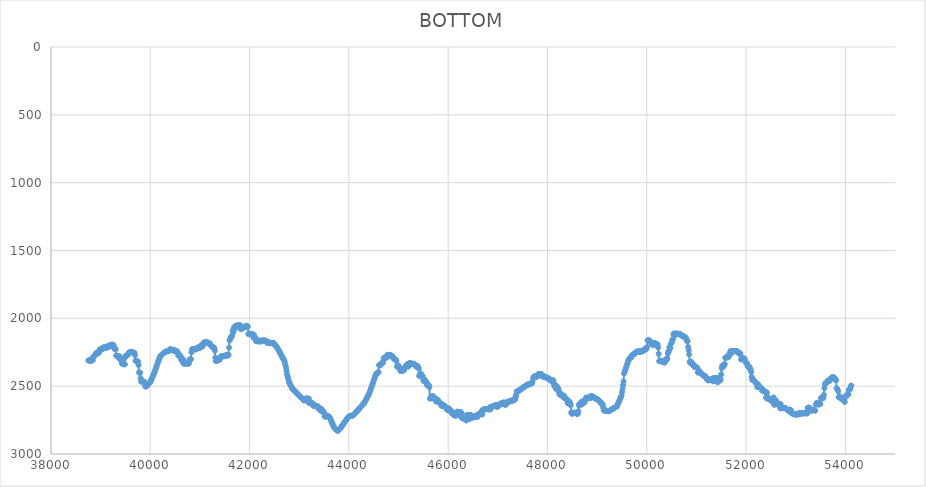
| Category | BOTTOM |
|---|---|
| 38753.4863 | 2310.27 |
| 38760.6201 | 2311.58 |
| 38770.8596 | 2310.26 |
| 38781.0997 | 2311.62 |
| 38791.3398 | 2311.66 |
| 38801.5799 | 2312.7 |
| 38811.82 | 2301.89 |
| 38822.0601 | 2306.12 |
| 38832.3002 | 2310.17 |
| 38842.5403 | 2308.02 |
| 38852.7804 | 2282.06 |
| 38863.0205 | 2281.94 |
| 38873.2606 | 2277.71 |
| 38883.5007 | 2273.53 |
| 38893.7407 | 2270.39 |
| 38903.9808 | 2256.73 |
| 38914.2209 | 2256.68 |
| 38924.461 | 2255.32 |
| 38934.7011 | 2255.4 |
| 38944.9412 | 2258.09 |
| 38955.1813 | 2256.68 |
| 38965.4214 | 2254.61 |
| 38975.6615 | 2231.39 |
| 38985.9016 | 2231.26 |
| 38996.1417 | 2227.25 |
| 39006.3818 | 2229.9 |
| 39016.6219 | 2227.25 |
| 39026.862 | 2229.65 |
| 39037.102 | 2218.68 |
| 39047.3421 | 2217.44 |
| 39057.5822 | 2221.28 |
| 39067.8223 | 2213.09 |
| 39078.0624 | 2213.09 |
| 39088.3025 | 2213.09 |
| 39098.5426 | 2213.13 |
| 39108.7827 | 2214.62 |
| 39119.0228 | 2218.39 |
| 39129.2629 | 2207.46 |
| 39139.503 | 2207.5 |
| 39149.7431 | 2208.82 |
| 39159.9832 | 2207.5 |
| 39170.2233 | 2208.62 |
| 39180.4633 | 2200.34 |
| 39190.7034 | 2197.52 |
| 39200.9435 | 2194.87 |
| 39211.1836 | 2197.69 |
| 39221.4237 | 2200.29 |
| 39231.6638 | 2196.11 |
| 39241.9039 | 2193.47 |
| 39252.144 | 2196.32 |
| 39262.3841 | 2201.09 |
| 39272.6242 | 2222.98 |
| 39282.8643 | 2224.39 |
| 39293.1044 | 2225.8 |
| 39303.3445 | 2228.6 |
| 39313.5846 | 2275.07 |
| 39323.8246 | 2276.43 |
| 39334.0647 | 2276.64 |
| 39344.3048 | 2283.26 |
| 39354.5449 | 2276.85 |
| 39364.785 | 2290.55 |
| 39375.0251 | 2291.54 |
| 39385.2652 | 2280.01 |
| 39395.5053 | 2304.58 |
| 39405.7454 | 2304.58 |
| 39415.9855 | 2305.43 |
| 39426.2256 | 2332.27 |
| 39436.4657 | 2317.84 |
| 39446.7058 | 2336.92 |
| 39456.9459 | 2335.59 |
| 39467.1859 | 2337.04 |
| 39477.426 | 2339.77 |
| 39487.6661 | 2338.17 |
| 39497.9062 | 2285.95 |
| 39508.1463 | 2275.02 |
| 39518.3864 | 2275.02 |
| 39528.6265 | 2274.86 |
| 39538.8666 | 2269.39 |
| 39549.1067 | 2269.22 |
| 39559.3468 | 2263.42 |
| 39569.5869 | 2252.38 |
| 39579.827 | 2248.36 |
| 39590.0671 | 2251.01 |
| 39600.3072 | 2248.28 |
| 39610.5472 | 2248.28 |
| 39620.7873 | 2248.32 |
| 39631.0274 | 2249.69 |
| 39641.2675 | 2249.73 |
| 39651.5076 | 2251.14 |
| 39661.7477 | 2252.54 |
| 39671.9878 | 2253.95 |
| 39682.2279 | 2255.79 |
| 39692.468 | 2272.08 |
| 39702.7081 | 2313.07 |
| 39712.9482 | 2314.48 |
| 39723.1883 | 2315.89 |
| 39733.4284 | 2317.3 |
| 39743.6685 | 2318.66 |
| 39753.9085 | 2319.43 |
| 39764.1486 | 2345.66 |
| 39774.3887 | 2398.89 |
| 39784.6288 | 2398.94 |
| 39794.8689 | 2401.5 |
| 39805.109 | 2440.53 |
| 39815.3491 | 2466.42 |
| 39825.5892 | 2465.05 |
| 39835.8293 | 2465.05 |
| 39846.0694 | 2465.1 |
| 39856.3095 | 2466.46 |
| 39866.5496 | 2466.55 |
| 39876.7897 | 2469.28 |
| 39887.0298 | 2470.26 |
| 39897.2698 | 2501.65 |
| 39907.5099 | 2501.65 |
| 39917.75 | 2501.61 |
| 39927.9901 | 2500.11 |
| 39938.2302 | 2495.68 |
| 39948.4703 | 2491.26 |
| 39958.7104 | 2486.84 |
| 39968.9505 | 2482.41 |
| 39979.1906 | 2477.99 |
| 39989.4307 | 2473.56 |
| 39999.6708 | 2469.02 |
| 40009.9109 | 2460.57 |
| 40020.151 | 2452.13 |
| 40030.3911 | 2443.68 |
| 40040.6311 | 2435.23 |
| 40050.8712 | 2426.79 |
| 40061.1113 | 2418.34 |
| 40071.3514 | 2409.9 |
| 40081.5915 | 2401.37 |
| 40091.8316 | 2390.29 |
| 40102.0717 | 2379.2 |
| 40112.3118 | 2368.12 |
| 40122.5519 | 2357.03 |
| 40132.792 | 2345.95 |
| 40143.0321 | 2334.86 |
| 40153.2722 | 2323.78 |
| 40163.5123 | 2312.75 |
| 40173.7524 | 2303.6 |
| 40183.9924 | 2294.45 |
| 40194.2325 | 2285.3 |
| 40204.4726 | 2276.33 |
| 40214.7127 | 2273.17 |
| 40224.9528 | 2270 |
| 40235.1929 | 2266.83 |
| 40245.433 | 2263.67 |
| 40255.6731 | 2260.5 |
| 40265.9132 | 2257.33 |
| 40276.1533 | 2254.16 |
| 40286.3934 | 2251.04 |
| 40296.6335 | 2249.16 |
| 40306.8736 | 2247.28 |
| 40317.1137 | 2245.41 |
| 40327.3537 | 2243.53 |
| 40337.5938 | 2241.65 |
| 40347.8339 | 2239.88 |
| 40358.074 | 2241.2 |
| 40368.3141 | 2239.83 |
| 40378.5542 | 2239.53 |
| 40388.7943 | 2229.98 |
| 40399.0344 | 2229.94 |
| 40409.2745 | 2228.66 |
| 40419.5146 | 2231.39 |
| 40429.7547 | 2231.39 |
| 40439.9948 | 2231.43 |
| 40450.2349 | 2232.88 |
| 40460.475 | 2235.7 |
| 40470.715 | 2238.3 |
| 40480.9551 | 2234.25 |
| 40491.1952 | 2235.83 |
| 40501.4353 | 2242.69 |
| 40511.6754 | 2243.97 |
| 40521.9155 | 2241.24 |
| 40532.1556 | 2241.33 |
| 40542.3957 | 2244.23 |
| 40552.6358 | 2250.43 |
| 40562.8759 | 2273.44 |
| 40573.116 | 2268.16 |
| 40583.3561 | 2273.53 |
| 40593.5962 | 2271.32 |
| 40603.8363 | 2287.47 |
| 40614.0763 | 2281.53 |
| 40624.3164 | 2308.59 |
| 40634.5565 | 2301.77 |
| 40644.7966 | 2301.73 |
| 40655.0367 | 2301.32 |
| 40665.2768 | 2330.89 |
| 40675.5169 | 2317.82 |
| 40685.757 | 2335.46 |
| 40695.9971 | 2332.74 |
| 40706.2372 | 2332.74 |
| 40716.4773 | 2332.74 |
| 40726.7174 | 2332.74 |
| 40736.9575 | 2332.69 |
| 40747.1976 | 2331.37 |
| 40757.4377 | 2332.78 |
| 40767.6777 | 2334.1 |
| 40777.9178 | 2331.82 |
| 40788.1579 | 2303.31 |
| 40798.398 | 2307.27 |
| 40808.6381 | 2303.13 |
| 40818.8782 | 2300.19 |
| 40829.1183 | 2250.39 |
| 40839.3584 | 2228.53 |
| 40849.5985 | 2227.17 |
| 40859.8386 | 2227.17 |
| 40870.0787 | 2227.08 |
| 40880.3188 | 2224.39 |
| 40890.5589 | 2225.8 |
| 40900.799 | 2227.21 |
| 40911.039 | 2228.53 |
| 40921.2791 | 2227.21 |
| 40931.5192 | 2228.22 |
| 40941.7593 | 2217.31 |
| 40951.9994 | 2217.4 |
| 40962.2395 | 2219.86 |
| 40972.4796 | 2211.68 |
| 40982.7197 | 2211.86 |
| 40992.9598 | 2217.31 |
| 41003.1999 | 2217.14 |
| 41013.44 | 2211.33 |
| 41023.6801 | 2200.33 |
| 41033.9202 | 2197.91 |
| 41044.1603 | 2207.46 |
| 41054.4003 | 2206.88 |
| 41064.6404 | 2188.81 |
| 41074.8805 | 2177.9 |
| 41085.1206 | 2177.9 |
| 41095.3607 | 2177.94 |
| 41105.6008 | 2179.22 |
| 41115.8409 | 2176.49 |
| 41126.081 | 2176.49 |
| 41136.3211 | 2176.54 |
| 41146.5612 | 2177.94 |
| 41156.8013 | 2179.35 |
| 41167.0414 | 2180.71 |
| 41177.2815 | 2180.98 |
| 41187.5216 | 2189.07 |
| 41197.7616 | 2186.43 |
| 41208.0017 | 2189.47 |
| 41218.2418 | 2199.15 |
| 41228.4819 | 2203.46 |
| 41238.722 | 2210.19 |
| 41248.9621 | 2207.55 |
| 41259.2022 | 2210.5 |
| 41269.4423 | 2217.4 |
| 41279.6824 | 2220.04 |
| 41289.9225 | 2217.93 |
| 41300.1626 | 2238.66 |
| 41310.4027 | 2289.9 |
| 41320.6428 | 2314.44 |
| 41330.8829 | 2314.22 |
| 41341.123 | 2307.27 |
| 41351.363 | 2303.44 |
| 41361.6031 | 2311.53 |
| 41371.8432 | 2308.36 |
| 41382.0833 | 2294.6 |
| 41392.3234 | 2290.95 |
| 41402.5635 | 2304.27 |
| 41412.8036 | 2294.29 |
| 41423.0437 | 2280.61 |
| 41433.2838 | 2279.2 |
| 41443.5239 | 2277.84 |
| 41453.764 | 2277.84 |
| 41464.0041 | 2277.88 |
| 41474.2442 | 2279.25 |
| 41484.4843 | 2279.16 |
| 41494.7243 | 2276.43 |
| 41504.9644 | 2276.39 |
| 41515.2045 | 2274.98 |
| 41525.4446 | 2273.53 |
| 41535.6847 | 2270.85 |
| 41545.9248 | 2272.25 |
| 41556.1649 | 2273.62 |
| 41566.405 | 2273.53 |
| 41576.6451 | 2269.1 |
| 41586.8852 | 2215.57 |
| 41597.1253 | 2162.28 |
| 41607.3654 | 2157.61 |
| 41617.6055 | 2139.89 |
| 41627.8456 | 2139.67 |
| 41638.0856 | 2132.77 |
| 41648.3257 | 2128.69 |
| 41658.5658 | 2088.44 |
| 41668.8059 | 2106.8 |
| 41679.046 | 2084.28 |
| 41689.2861 | 2063.1 |
| 41699.5262 | 2081.42 |
| 41709.7663 | 2058.25 |
| 41720.0064 | 2058.12 |
| 41730.2465 | 2054.03 |
| 41740.4866 | 2054.03 |
| 41750.7267 | 2053.98 |
| 41760.9668 | 2052.62 |
| 41771.2069 | 2052.62 |
| 41781.447 | 2052.62 |
| 41791.687 | 2052.49 |
| 41801.9271 | 2048.67 |
| 41812.1672 | 2057.56 |
| 41822.4073 | 2079.32 |
| 41832.6474 | 2077.87 |
| 41842.8875 | 2075.14 |
| 41853.1276 | 2074.96 |
| 41863.3677 | 2069.47 |
| 41873.6078 | 2067.97 |
| 41883.8479 | 2063.79 |
| 41894.088 | 2061.11 |
| 41904.3281 | 2062.43 |
| 41914.5682 | 2061.11 |
| 41924.8083 | 2062.29 |
| 41935.0483 | 2056.84 |
| 41945.2884 | 2056.93 |
| 41955.5285 | 2059.66 |
| 41965.7686 | 2061.47 |
| 41976.0087 | 2115.96 |
| 41986.2488 | 2116.01 |
| 41996.4889 | 2117.33 |
| 42006.729 | 2115.92 |
| 42016.9691 | 2114.6 |
| 42027.2092 | 2115.92 |
| 42037.4493 | 2114.56 |
| 42047.6894 | 2114.6 |
| 42057.9295 | 2115.96 |
| 42068.1696 | 2116.87 |
| 42078.4097 | 2143.39 |
| 42088.6497 | 2122.28 |
| 42098.8898 | 2142.71 |
| 42109.1299 | 2142.71 |
| 42119.37 | 2143.53 |
| 42129.6101 | 2168.05 |
| 42139.8502 | 2168 |
| 42150.0903 | 2166.73 |
| 42160.3304 | 2169.45 |
| 42170.5705 | 2169.36 |
| 42180.8106 | 2166.59 |
| 42191.0507 | 2165.18 |
| 42201.2908 | 2164.05 |
| 42211.5309 | 2170.86 |
| 42221.771 | 2170.82 |
| 42232.011 | 2169.32 |
| 42242.2511 | 2165.18 |
| 42252.4912 | 2163.82 |
| 42262.7313 | 2163.82 |
| 42272.9714 | 2163.82 |
| 42283.2115 | 2163.82 |
| 42293.4516 | 2163.82 |
| 42303.6917 | 2163.82 |
| 42313.9318 | 2163.91 |
| 42324.1719 | 2166.68 |
| 42334.412 | 2168.05 |
| 42344.6521 | 2168.5 |
| 42354.8922 | 2182.08 |
| 42365.1323 | 2180.62 |
| 42375.3723 | 2177.9 |
| 42385.6124 | 2177.9 |
| 42395.8525 | 2178.08 |
| 42406.0926 | 2183.52 |
| 42416.3327 | 2183.11 |
| 42426.5728 | 2182.71 |
| 42436.8129 | 2182.31 |
| 42447.053 | 2181.91 |
| 42457.2931 | 2181.51 |
| 42467.5332 | 2181.1 |
| 42477.7733 | 2180.86 |
| 42488.0134 | 2185.44 |
| 42498.2535 | 2190.01 |
| 42508.4936 | 2194.59 |
| 42518.7337 | 2199.16 |
| 42528.9737 | 2203.74 |
| 42539.2138 | 2208.31 |
| 42549.4539 | 2212.89 |
| 42559.694 | 2217.54 |
| 42569.9341 | 2224.58 |
| 42580.1742 | 2231.62 |
| 42590.4143 | 2238.66 |
| 42600.6544 | 2245.69 |
| 42610.8945 | 2252.73 |
| 42621.1346 | 2259.61 |
| 42631.3747 | 2266.49 |
| 42641.6148 | 2273.39 |
| 42651.8549 | 2280.86 |
| 42662.095 | 2287.14 |
| 42672.335 | 2294.02 |
| 42682.5751 | 2300.9 |
| 42692.8152 | 2307.78 |
| 42703.0553 | 2314.96 |
| 42713.2954 | 2330.91 |
| 42723.5355 | 2346.87 |
| 42733.7756 | 2363.08 |
| 42744.0157 | 2387.01 |
| 42754.2558 | 2410.64 |
| 42764.4959 | 2425.42 |
| 42774.736 | 2440.2 |
| 42784.9761 | 2454.98 |
| 42795.2162 | 2469.53 |
| 42805.4563 | 2477.27 |
| 42815.6964 | 2485.01 |
| 42825.9364 | 2492.76 |
| 42836.1765 | 2500.5 |
| 42846.4166 | 2508.24 |
| 42856.6567 | 2515.85 |
| 42866.8968 | 2519.64 |
| 42877.1369 | 2523.43 |
| 42887.377 | 2527.22 |
| 42897.6171 | 2531.01 |
| 42907.8572 | 2534.8 |
| 42918.0973 | 2538.59 |
| 42928.3374 | 2542.38 |
| 42938.5775 | 2546.17 |
| 42948.8176 | 2549.96 |
| 42959.0577 | 2553.75 |
| 42969.2978 | 2557.54 |
| 42979.5378 | 2561.33 |
| 42989.7779 | 2565.12 |
| 43000.018 | 2568.96 |
| 43010.2581 | 2572.8 |
| 43020.4982 | 2576.64 |
| 43030.7383 | 2580.48 |
| 43040.9784 | 2584.31 |
| 43051.2185 | 2588.15 |
| 43061.4586 | 2591.99 |
| 43071.6987 | 2595.83 |
| 43081.9388 | 2599.67 |
| 43092.1789 | 2603.51 |
| 43102.419 | 2606.76 |
| 43112.6591 | 2593.19 |
| 43122.8991 | 2594.46 |
| 43133.1392 | 2591.69 |
| 43143.3793 | 2590.38 |
| 43153.6194 | 2591.97 |
| 43163.8595 | 2598.5 |
| 43174.0996 | 2591.22 |
| 43184.3397 | 2616.19 |
| 43194.5798 | 2591.5 |
| 43204.8199 | 2625.47 |
| 43215.06 | 2624.16 |
| 43225.3001 | 2625.52 |
| 43235.5402 | 2625.43 |
| 43245.7803 | 2622.8 |
| 43256.0204 | 2625.75 |
| 43266.2605 | 2632.37 |
| 43276.5005 | 2627.58 |
| 43286.7406 | 2646.49 |
| 43296.9807 | 2642.41 |
| 43307.2208 | 2642.41 |
| 43317.4609 | 2642.51 |
| 43327.701 | 2645.23 |
| 43337.9411 | 2645.46 |
| 43348.1812 | 2652.17 |
| 43358.4213 | 2649.36 |
| 43368.6614 | 2646.82 |
| 43378.9015 | 2652.22 |
| 43389.1416 | 2651.52 |
| 43399.3817 | 2670.52 |
| 43409.6218 | 2669.16 |
| 43419.8619 | 2669.11 |
| 43430.1019 | 2668.31 |
| 43440.342 | 2684.08 |
| 43450.5821 | 2668.36 |
| 43460.8222 | 2686.05 |
| 43471.0623 | 2686.05 |
| 43481.3024 | 2686.1 |
| 43491.5425 | 2687.69 |
| 43501.7826 | 2695.48 |
| 43512.0227 | 2724.05 |
| 43522.2628 | 2724.05 |
| 43532.5029 | 2723.87 |
| 43542.743 | 2718.42 |
| 43552.9831 | 2718.42 |
| 43563.2232 | 2718.42 |
| 43573.4632 | 2718.61 |
| 43583.7033 | 2724.1 |
| 43593.9434 | 2725.46 |
| 43604.1835 | 2725.6 |
| 43614.4236 | 2729.98 |
| 43624.6637 | 2738.9 |
| 43634.9038 | 2747.81 |
| 43645.1439 | 2756.73 |
| 43655.384 | 2765.64 |
| 43665.6241 | 2774.56 |
| 43675.8642 | 2783.42 |
| 43686.1043 | 2790.81 |
| 43696.3444 | 2798.2 |
| 43706.5845 | 2805.59 |
| 43716.8246 | 2812.83 |
| 43727.0646 | 2815.64 |
| 43737.3047 | 2818.46 |
| 43747.5448 | 2821.27 |
| 43757.7849 | 2824.09 |
| 43768.025 | 2826.9 |
| 43778.2651 | 2829.49 |
| 43788.5052 | 2825.55 |
| 43798.7453 | 2821.61 |
| 43808.9854 | 2817.67 |
| 43819.2255 | 2813.73 |
| 43829.4656 | 2809.74 |
| 43839.7057 | 2804.41 |
| 43849.9458 | 2799.08 |
| 43860.1859 | 2793.75 |
| 43870.426 | 2788.42 |
| 43880.666 | 2783.09 |
| 43890.9061 | 2777.77 |
| 43901.1462 | 2772.44 |
| 43911.3863 | 2767.11 |
| 43921.6264 | 2761.78 |
| 43931.8665 | 2756.45 |
| 43942.1066 | 2751.12 |
| 43952.3467 | 2745.79 |
| 43962.5868 | 2740.46 |
| 43972.8269 | 2735.17 |
| 43983.067 | 2730.95 |
| 43993.3071 | 2726.73 |
| 44003.5472 | 2722.62 |
| 44013.7873 | 2721.74 |
| 44024.0274 | 2720.86 |
| 44034.2674 | 2719.98 |
| 44044.5075 | 2719.1 |
| 44054.7476 | 2718.22 |
| 44064.9877 | 2717.34 |
| 44075.2278 | 2716.46 |
| 44085.4679 | 2715.47 |
| 44095.708 | 2711.35 |
| 44105.9481 | 2707.24 |
| 44116.1882 | 2703.12 |
| 44126.4283 | 2699.01 |
| 44136.6684 | 2694.9 |
| 44146.9085 | 2690.78 |
| 44157.1486 | 2686.67 |
| 44167.3887 | 2682.55 |
| 44177.6287 | 2678.44 |
| 44187.8688 | 2674.32 |
| 44198.1089 | 2670.21 |
| 44208.349 | 2666.09 |
| 44218.5891 | 2661.97 |
| 44228.8292 | 2657.59 |
| 44239.0693 | 2653.21 |
| 44249.3094 | 2648.83 |
| 44259.5495 | 2644.45 |
| 44269.7896 | 2640.07 |
| 44280.0297 | 2635.69 |
| 44290.2698 | 2631.31 |
| 44300.5099 | 2626.94 |
| 44310.75 | 2622.47 |
| 44320.9901 | 2615.43 |
| 44331.2301 | 2608.39 |
| 44341.4702 | 2601.35 |
| 44351.7103 | 2594.31 |
| 44361.9504 | 2587.27 |
| 44372.1905 | 2580.24 |
| 44382.4306 | 2573.2 |
| 44392.6707 | 2566.16 |
| 44402.9108 | 2559.01 |
| 44413.1509 | 2548.76 |
| 44423.391 | 2538.5 |
| 44433.6311 | 2528.25 |
| 44443.8712 | 2517.99 |
| 44454.1113 | 2507.73 |
| 44464.3514 | 2497.48 |
| 44474.5915 | 2487.2 |
| 44484.8315 | 2476.14 |
| 44495.0716 | 2465.08 |
| 44505.3117 | 2454.02 |
| 44515.5518 | 2442.96 |
| 44525.7919 | 2431.9 |
| 44536.032 | 2420.84 |
| 44546.2721 | 2410.01 |
| 44556.5122 | 2405.93 |
| 44566.7523 | 2405.93 |
| 44576.9924 | 2405.64 |
| 44587.2325 | 2397.54 |
| 44597.4726 | 2397.01 |
| 44607.7127 | 2344.09 |
| 44617.9528 | 2346.81 |
| 44628.1929 | 2346.62 |
| 44638.4329 | 2340.94 |
| 44648.673 | 2334.05 |
| 44658.9131 | 2331.33 |
| 44669.1532 | 2331.28 |
| 44679.3933 | 2329.82 |
| 44689.6334 | 2326.04 |
| 44699.8735 | 2295.94 |
| 44710.1136 | 2290.46 |
| 44720.3537 | 2289.1 |
| 44730.5938 | 2289.1 |
| 44740.8339 | 2289.1 |
| 44751.074 | 2289.1 |
| 44761.3141 | 2288.47 |
| 44771.5542 | 2270.8 |
| 44781.7943 | 2271.09 |
| 44792.0343 | 2278.96 |
| 44802.2744 | 2270.75 |
| 44812.5145 | 2269.39 |
| 44822.7546 | 2269.44 |
| 44832.9947 | 2270.85 |
| 44843.2348 | 2272.31 |
| 44853.4749 | 2275.12 |
| 44863.715 | 2277.89 |
| 44873.9551 | 2279.34 |
| 44884.1952 | 2282.5 |
| 44894.4353 | 2294.78 |
| 44904.6754 | 2296.33 |
| 44914.9155 | 2301.67 |
| 44925.1556 | 2299.15 |
| 44935.3957 | 2304.58 |
| 44945.6357 | 2304.88 |
| 44955.8758 | 2314.49 |
| 44966.1159 | 2355.26 |
| 44976.356 | 2355.26 |
| 44986.5961 | 2354.97 |
| 44996.8362 | 2347.11 |
| 45007.0763 | 2355.55 |
| 45017.3164 | 2364 |
| 45027.5565 | 2372.74 |
| 45037.7966 | 2388.8 |
| 45048.0367 | 2381.76 |
| 45058.2768 | 2375.21 |
| 45068.5169 | 2382.25 |
| 45078.757 | 2388.8 |
| 45088.9971 | 2382 |
| 45099.2371 | 2382.05 |
| 45109.4772 | 2382.77 |
| 45119.7173 | 2365.11 |
| 45129.9574 | 2364.87 |
| 45140.1975 | 2357.78 |
| 45150.4376 | 2349.48 |
| 45160.6777 | 2345.16 |
| 45170.9178 | 2338.66 |
| 45181.1579 | 2347.11 |
| 45191.398 | 2355.26 |
| 45201.6381 | 2354.42 |
| 45211.8782 | 2331.33 |
| 45222.1183 | 2331.43 |
| 45232.3584 | 2333.95 |
| 45242.5985 | 2328.76 |
| 45252.8385 | 2335.55 |
| 45263.0786 | 2335.55 |
| 45273.3187 | 2335.55 |
| 45283.5588 | 2335.55 |
| 45293.7989 | 2335.5 |
| 45304.039 | 2334.24 |
| 45314.2791 | 2337.01 |
| 45324.5192 | 2338.56 |
| 45334.7593 | 2344.19 |
| 45344.9994 | 2349.83 |
| 45355.2395 | 2355.26 |
| 45365.4796 | 2355.16 |
| 45375.7197 | 2352.44 |
| 45385.9598 | 2352.74 |
| 45396.1999 | 2361.19 |
| 45406.4399 | 2371.31 |
| 45416.68 | 2425.34 |
| 45426.9201 | 2416.95 |
| 45437.1602 | 2410.01 |
| 45447.4003 | 2406.23 |
| 45457.6404 | 2414.48 |
| 45467.8805 | 2417.44 |
| 45478.1206 | 2424.38 |
| 45488.3607 | 2429.39 |
| 45498.6008 | 2455.5 |
| 45508.8409 | 2463.5 |
| 45519.081 | 2459.12 |
| 45529.3211 | 2451.27 |
| 45539.5612 | 2459.62 |
| 45549.8013 | 2465.25 |
| 45560.0413 | 2471.33 |
| 45570.2814 | 2489.18 |
| 45580.5215 | 2494.51 |
| 45590.7616 | 2491.7 |
| 45601.0017 | 2489.23 |
| 45611.2418 | 2496.32 |
| 45621.4819 | 2507.54 |
| 45631.722 | 2591.64 |
| 45641.9621 | 2588.62 |
| 45652.2022 | 2580.23 |
| 45662.4423 | 2574.04 |
| 45672.6824 | 2590.08 |
| 45682.9225 | 2582.89 |
| 45693.1626 | 2572.63 |
| 45703.4027 | 2588.92 |
| 45713.6427 | 2588.77 |
| 45723.8828 | 2584.85 |
| 45734.1229 | 2588.92 |
| 45744.363 | 2589.77 |
| 45754.6031 | 2612.55 |
| 45764.8432 | 2604.51 |
| 45775.0833 | 2607.02 |
| 45785.3234 | 2601.59 |
| 45795.5635 | 2601.89 |
| 45805.8036 | 2610.44 |
| 45816.0437 | 2621.35 |
| 45826.2838 | 2622.76 |
| 45836.5239 | 2624.21 |
| 45846.764 | 2627.08 |
| 45857.0041 | 2631.65 |
| 45867.2441 | 2645.23 |
| 45877.4842 | 2645.08 |
| 45887.7243 | 2641 |
| 45897.9644 | 2640.85 |
| 45908.2045 | 2637.03 |
| 45918.4446 | 2643.97 |
| 45928.6847 | 2648.04 |
| 45938.9248 | 2648.39 |
| 45949.1649 | 2658 |
| 45959.405 | 2660.71 |
| 45969.6451 | 2661.16 |
| 45979.8852 | 2673.53 |
| 45990.1253 | 2677.05 |
| 46000.3654 | 2662.27 |
| 46010.6055 | 2666.39 |
| 46020.8455 | 2667.8 |
| 46031.0856 | 2669.76 |
| 46041.3257 | 2686.1 |
| 46051.5658 | 2687.51 |
| 46061.8059 | 2688.81 |
| 46072.046 | 2687.46 |
| 46082.2861 | 2688.16 |
| 46092.5262 | 2707.16 |
| 46102.7663 | 2707.31 |
| 46113.0064 | 2710.93 |
| 46123.2465 | 2699.42 |
| 46133.4866 | 2718.22 |
| 46143.7267 | 2712.29 |
| 46153.9668 | 2699.32 |
| 46164.2069 | 2715.61 |
| 46174.447 | 2714.55 |
| 46184.687 | 2687.05 |
| 46194.9271 | 2713.5 |
| 46205.1672 | 2694.49 |
| 46215.4073 | 2694.49 |
| 46225.6474 | 2694.39 |
| 46235.8875 | 2691.68 |
| 46246.1276 | 2691.73 |
| 46256.3677 | 2693.14 |
| 46266.6078 | 2695.96 |
| 46276.8479 | 2735.21 |
| 46287.088 | 2732.7 |
| 46297.3281 | 2738.13 |
| 46307.5682 | 2738.03 |
| 46317.8083 | 2735.31 |
| 46328.0484 | 2735.37 |
| 46338.2884 | 2736.77 |
| 46348.5285 | 2738.69 |
| 46358.7686 | 2752.15 |
| 46369.0087 | 2713.7 |
| 46379.2488 | 2738.18 |
| 46389.4889 | 2739.79 |
| 46399.729 | 2745.31 |
| 46409.9691 | 2711.39 |
| 46420.2092 | 2712.5 |
| 46430.4493 | 2742.1 |
| 46440.6894 | 2734.5 |
| 46450.9295 | 2712.79 |
| 46461.1696 | 2713.45 |
| 46471.4097 | 2731.04 |
| 46481.6498 | 2729.68 |
| 46491.8898 | 2729.68 |
| 46502.1299 | 2729.63 |
| 46512.37 | 2728.28 |
| 46522.6101 | 2728.28 |
| 46532.8502 | 2727.97 |
| 46543.0903 | 2719.78 |
| 46553.3304 | 2718.42 |
| 46563.5705 | 2718.37 |
| 46573.8106 | 2717.32 |
| 46584.0507 | 2725.46 |
| 46594.2908 | 2724.8 |
| 46604.5309 | 2707.16 |
| 46614.771 | 2707.11 |
| 46625.0111 | 2705.7 |
| 46635.2512 | 2704.35 |
| 46645.4912 | 2704.35 |
| 46655.7313 | 2704.45 |
| 46665.9714 | 2706.14 |
| 46676.2115 | 2680.13 |
| 46686.4516 | 2708.7 |
| 46696.6917 | 2674.74 |
| 46706.9318 | 2673.38 |
| 46717.1719 | 2673.28 |
| 46727.412 | 2670.56 |
| 46737.6521 | 2670.56 |
| 46747.8922 | 2670.56 |
| 46758.1323 | 2670.51 |
| 46768.3724 | 2669.16 |
| 46778.6125 | 2669.11 |
| 46788.8526 | 2667.75 |
| 46799.0927 | 2667.8 |
| 46809.3327 | 2669.16 |
| 46819.5728 | 2669.26 |
| 46829.8129 | 2671.36 |
| 46840.053 | 2655.74 |
| 46850.2931 | 2672.66 |
| 46860.5332 | 2653.62 |
| 46870.7733 | 2652.21 |
| 46881.0134 | 2650.91 |
| 46891.2535 | 2652.16 |
| 46901.4936 | 2649.4 |
| 46911.7337 | 2647.99 |
| 46921.9738 | 2646.63 |
| 46932.2139 | 2646.63 |
| 46942.454 | 2646.38 |
| 46952.6941 | 2639.55 |
| 46962.9341 | 2638.65 |
| 46973.1742 | 2650.86 |
| 46983.4143 | 2650.86 |
| 46993.6544 | 2650.86 |
| 47003.8945 | 2650.34 |
| 47014.1346 | 2636.78 |
| 47024.3747 | 2636.88 |
| 47034.6148 | 2639.55 |
| 47044.8549 | 2637.83 |
| 47055.095 | 2628.34 |
| 47065.3351 | 2628.34 |
| 47075.5752 | 2628.39 |
| 47085.8153 | 2629.74 |
| 47096.0554 | 2629.44 |
| 47106.2955 | 2621.3 |
| 47116.5355 | 2621.3 |
| 47126.7756 | 2621.3 |
| 47137.0157 | 2621.92 |
| 47147.2558 | 2638.19 |
| 47157.4959 | 2637.83 |
| 47167.736 | 2627.98 |
| 47177.9761 | 2618.64 |
| 47188.2162 | 2622.45 |
| 47198.4563 | 2615.82 |
| 47208.6964 | 2619.74 |
| 47218.9365 | 2615.62 |
| 47229.1766 | 2614.11 |
| 47239.4167 | 2610.04 |
| 47249.6568 | 2609.99 |
| 47259.8969 | 2608.63 |
| 47270.137 | 2608.68 |
| 47280.377 | 2610.04 |
| 47290.6171 | 2609.62 |
| 47300.8572 | 2598.83 |
| 47311.0973 | 2600.13 |
| 47321.3374 | 2598.78 |
| 47331.5775 | 2598.83 |
| 47341.8176 | 2600.08 |
| 47352.0577 | 2596.23 |
| 47362.2978 | 2566.71 |
| 47372.5379 | 2573.45 |
| 47382.778 | 2536.84 |
| 47393.0181 | 2536.74 |
| 47403.2582 | 2534.03 |
| 47413.4983 | 2534.08 |
| 47423.7384 | 2535.23 |
| 47433.9784 | 2529.75 |
| 47444.2185 | 2528.29 |
| 47454.4586 | 2525.42 |
| 47464.6987 | 2521.36 |
| 47474.9388 | 2521.31 |
| 47485.1789 | 2519.69 |
| 47495.419 | 2512.86 |
| 47505.6591 | 2511.4 |
| 47515.8992 | 2508.53 |
| 47526.1393 | 2504.47 |
| 47536.3794 | 2504.36 |
| 47546.6195 | 2501.55 |
| 47556.8596 | 2498.73 |
| 47567.0997 | 2495.92 |
| 47577.3398 | 2493.2 |
| 47587.5799 | 2493 |
| 47597.8199 | 2487.63 |
| 47608.06 | 2488.83 |
| 47618.3001 | 2484.81 |
| 47628.5402 | 2486.17 |
| 47638.7803 | 2486.01 |
| 47649.0204 | 2481.94 |
| 47659.2605 | 2481.89 |
| 47669.5006 | 2480.48 |
| 47679.7407 | 2479.13 |
| 47689.9808 | 2478.71 |
| 47700.2209 | 2466.93 |
| 47710.461 | 2442.06 |
| 47720.7011 | 2430.07 |
| 47730.9412 | 2435.49 |
| 47741.1813 | 2435.08 |
| 47751.4213 | 2424.34 |
| 47761.6614 | 2427.2 |
| 47771.9015 | 2431.32 |
| 47782.1416 | 2432.36 |
| 47792.3817 | 2424.07 |
| 47802.6218 | 2419.7 |
| 47812.8619 | 2411.62 |
| 47823.102 | 2413.28 |
| 47833.3421 | 2421.05 |
| 47843.5822 | 2411.72 |
| 47853.8223 | 2415.58 |
| 47864.0624 | 2410.21 |
| 47874.3025 | 2411.72 |
| 47884.5426 | 2416.26 |
| 47894.7827 | 2428.51 |
| 47905.0228 | 2429.86 |
| 47915.2628 | 2429.65 |
| 47925.5029 | 2424.39 |
| 47935.743 | 2428.61 |
| 47945.9831 | 2432.68 |
| 47956.2232 | 2432.83 |
| 47966.4633 | 2436.9 |
| 47976.7034 | 2436.95 |
| 47986.9435 | 2438.36 |
| 47997.1836 | 2439.66 |
| 48007.4237 | 2438.47 |
| 48017.6638 | 2442.74 |
| 48027.9039 | 2448.32 |
| 48038.144 | 2452.33 |
| 48048.3841 | 2451.03 |
| 48058.6242 | 2452.65 |
| 48068.8642 | 2459.16 |
| 48079.1043 | 2452.8 |
| 48089.3444 | 2463.64 |
| 48099.5845 | 2463.38 |
| 48109.8246 | 2456.61 |
| 48120.0647 | 2457.66 |
| 48130.3048 | 2485.39 |
| 48140.5449 | 2501.12 |
| 48150.785 | 2488.05 |
| 48161.0251 | 2500.98 |
| 48171.2652 | 2519.95 |
| 48181.5053 | 2519.21 |
| 48191.7454 | 2500.66 |
| 48201.9855 | 2511.66 |
| 48212.2256 | 2515.83 |
| 48222.4657 | 2519.6 |
| 48232.7057 | 2547.27 |
| 48242.9458 | 2561.65 |
| 48253.1859 | 2548.63 |
| 48263.426 | 2562.28 |
| 48273.6661 | 2565.05 |
| 48283.9062 | 2566.4 |
| 48294.1463 | 2566.82 |
| 48304.3864 | 2577.29 |
| 48314.6265 | 2567.91 |
| 48324.8666 | 2570.62 |
| 48335.1067 | 2571.31 |
| 48345.3468 | 2589.03 |
| 48355.5869 | 2591.69 |
| 48365.827 | 2590.49 |
| 48376.0671 | 2594.55 |
| 48386.3072 | 2594.66 |
| 48396.5472 | 2598.48 |
| 48406.7873 | 2626.29 |
| 48417.0274 | 2610.62 |
| 48427.2675 | 2625.52 |
| 48437.5076 | 2625.1 |
| 48447.7477 | 2614.74 |
| 48457.9878 | 2627.41 |
| 48468.2279 | 2641.61 |
| 48478.468 | 2693.46 |
| 48488.7081 | 2702.94 |
| 48498.9482 | 2702.67 |
| 48509.1883 | 2696.06 |
| 48519.4284 | 2700.07 |
| 48529.6685 | 2698.66 |
| 48539.9086 | 2697.26 |
| 48550.1486 | 2695.9 |
| 48560.3887 | 2695.95 |
| 48570.6288 | 2697.42 |
| 48580.8689 | 2700.18 |
| 48591.109 | 2701.64 |
| 48601.3491 | 2704.4 |
| 48611.5892 | 2705.01 |
| 48621.8293 | 2684.4 |
| 48632.0694 | 2641.99 |
| 48642.3095 | 2631.1 |
| 48652.5496 | 2630.01 |
| 48662.7897 | 2636.78 |
| 48673.0298 | 2635.93 |
| 48683.2699 | 2614.31 |
| 48693.51 | 2616.36 |
| 48703.7501 | 2633.11 |
| 48713.9901 | 2611.55 |
| 48724.2302 | 2614.53 |
| 48734.4703 | 2621.3 |
| 48744.7104 | 2620.76 |
| 48754.9505 | 2607.17 |
| 48765.1906 | 2605.07 |
| 48775.4307 | 2586.05 |
| 48785.6708 | 2584.7 |
| 48795.9109 | 2584.7 |
| 48806.151 | 2584.75 |
| 48816.3911 | 2586.11 |
| 48826.6312 | 2586.05 |
| 48836.8713 | 2584.81 |
| 48847.1114 | 2587.46 |
| 48857.3515 | 2586.16 |
| 48867.5916 | 2586.87 |
| 48877.8316 | 2570.94 |
| 48888.0717 | 2579.02 |
| 48898.3118 | 2577.66 |
| 48908.5519 | 2577.66 |
| 48918.792 | 2577.88 |
| 48929.0321 | 2583.36 |
| 48939.2722 | 2585.24 |
| 48949.5123 | 2587.12 |
| 48959.7524 | 2588.99 |
| 48969.9925 | 2590.87 |
| 48980.2326 | 2592.75 |
| 48990.4727 | 2594.62 |
| 49000.7128 | 2596.5 |
| 49010.9529 | 2598.38 |
| 49021.193 | 2600.34 |
| 49031.4331 | 2604.41 |
| 49041.6731 | 2608.47 |
| 49051.9132 | 2612.54 |
| 49062.1533 | 2616.6 |
| 49072.3934 | 2620.67 |
| 49082.6335 | 2624.74 |
| 49092.8736 | 2628.8 |
| 49103.1137 | 2632.87 |
| 49113.3538 | 2637.56 |
| 49123.5939 | 2657.97 |
| 49133.834 | 2677.63 |
| 49144.0741 | 2678.33 |
| 49154.3142 | 2679.04 |
| 49164.5543 | 2679.74 |
| 49174.7944 | 2680.44 |
| 49185.0345 | 2681.15 |
| 49195.2746 | 2681.85 |
| 49205.5146 | 2682.56 |
| 49215.7547 | 2683.26 |
| 49225.9948 | 2683.96 |
| 49236.2349 | 2684.55 |
| 49246.475 | 2682.27 |
| 49256.7151 | 2679.98 |
| 49266.9552 | 2677.69 |
| 49277.1953 | 2675.4 |
| 49287.4354 | 2673.12 |
| 49297.6755 | 2670.83 |
| 49307.9156 | 2668.54 |
| 49318.1557 | 2666.25 |
| 49328.3958 | 2663.97 |
| 49338.6359 | 2661.68 |
| 49348.876 | 2659.39 |
| 49359.116 | 2657.1 |
| 49369.3561 | 2654.82 |
| 49379.5962 | 2652.53 |
| 49389.8363 | 2650.24 |
| 49400.0764 | 2647.71 |
| 49410.3165 | 2638.95 |
| 49420.5566 | 2630.19 |
| 49430.7967 | 2621.43 |
| 49441.0368 | 2612.67 |
| 49451.2769 | 2603.91 |
| 49461.517 | 2595.15 |
| 49471.7571 | 2586.4 |
| 49481.9972 | 2577.64 |
| 49492.2373 | 2568.23 |
| 49502.4774 | 2542.54 |
| 49512.7175 | 2516.85 |
| 49522.9575 | 2491.16 |
| 49533.1976 | 2464.18 |
| 49543.4377 | 2406.91 |
| 49553.6778 | 2395.64 |
| 49563.9179 | 2384.38 |
| 49574.158 | 2373.12 |
| 49584.3981 | 2361.86 |
| 49594.6382 | 2350.6 |
| 49604.8783 | 2339.34 |
| 49615.1184 | 2328.08 |
| 49625.3585 | 2316.82 |
| 49635.5986 | 2305.77 |
| 49645.8387 | 2300.09 |
| 49656.0788 | 2293.43 |
| 49666.3189 | 2295.81 |
| 49676.559 | 2287.64 |
| 49686.799 | 2285.79 |
| 49697.0391 | 2273.62 |
| 49707.2792 | 2273.51 |
| 49717.5193 | 2270.64 |
| 49727.7594 | 2266.52 |
| 49737.9995 | 2265.01 |
| 49748.2396 | 2260.95 |
| 49758.4797 | 2260.78 |
| 49768.7198 | 2256.51 |
| 49778.9599 | 2250.99 |
| 49789.2 | 2248.17 |
| 49799.4401 | 2245.41 |
| 49809.6802 | 2244.17 |
| 49819.9203 | 2246.82 |
| 49830.1604 | 2245.36 |
| 49840.4005 | 2242.81 |
| 49850.6405 | 2246.87 |
| 49860.8806 | 2246.76 |
| 49871.1207 | 2244.06 |
| 49881.3608 | 2244 |
| 49891.6009 | 2242.7 |
| 49901.841 | 2244.06 |
| 49912.0811 | 2243.84 |
| 49922.3212 | 2238.37 |
| 49932.5613 | 2237.02 |
| 49942.8014 | 2236.69 |
| 49953.0415 | 2228.52 |
| 49963.2816 | 2227.17 |
| 49973.5217 | 2227.28 |
| 49983.7618 | 2229.38 |
| 49994.0019 | 2214.61 |
| 50004.242 | 2215.17 |
| 50014.482 | 2162.42 |
| 50024.7221 | 2162.42 |
| 50034.9622 | 2162.47 |
| 50045.2023 | 2163.82 |
| 50055.4424 | 2163.99 |
| 50065.6825 | 2168.43 |
| 50075.9226 | 2178.01 |
| 50086.1627 | 2181.04 |
| 50096.4028 | 2188.99 |
| 50106.6429 | 2184.94 |
| 50116.883 | 2185.49 |
| 50127.1231 | 2198.3 |
| 50137.3632 | 2180.82 |
| 50147.6033 | 2183.58 |
| 50157.8434 | 2184.88 |
| 50168.0835 | 2183.8 |
| 50178.3235 | 2190.62 |
| 50188.5636 | 2191.92 |
| 50198.8037 | 2190.62 |
| 50209.0438 | 2192.03 |
| 50219.2839 | 2194.15 |
| 50229.524 | 2214.91 |
| 50239.7641 | 2261.75 |
| 50250.0042 | 2315.73 |
| 50260.2443 | 2313.03 |
| 50270.4844 | 2313.03 |
| 50280.7245 | 2313.03 |
| 50290.9646 | 2313.25 |
| 50301.2047 | 2318.66 |
| 50311.4448 | 2318.77 |
| 50321.6849 | 2321.48 |
| 50331.925 | 2321.53 |
| 50342.165 | 2322.94 |
| 50352.4051 | 2324.4 |
| 50362.6452 | 2326.22 |
| 50372.8853 | 2304.64 |
| 50383.1254 | 2305.94 |
| 50393.3655 | 2304.64 |
| 50403.6056 | 2305.55 |
| 50413.8457 | 2293.4 |
| 50424.0858 | 2260.28 |
| 50434.3259 | 2244.11 |
| 50444.566 | 2244.13 |
| 50454.8061 | 2212.07 |
| 50465.0462 | 2221.53 |
| 50475.2863 | 2220.26 |
| 50485.5264 | 2188.94 |
| 50495.7665 | 2183.2 |
| 50506.0065 | 2174.42 |
| 50516.2466 | 2158.08 |
| 50526.4867 | 2153.93 |
| 50536.7268 | 2118.45 |
| 50546.9669 | 2111.06 |
| 50557.207 | 2128.35 |
| 50567.4471 | 2121.21 |
| 50577.6872 | 2111.8 |
| 50587.9273 | 2113.2 |
| 50598.1674 | 2114.44 |
| 50608.4075 | 2111.85 |
| 50618.6476 | 2114.61 |
| 50628.8877 | 2115.96 |
| 50639.1278 | 2115.91 |
| 50649.3679 | 2114.56 |
| 50659.608 | 2114.61 |
| 50669.8481 | 2116.13 |
| 50680.0881 | 2120.3 |
| 50690.3282 | 2123.17 |
| 50700.5683 | 2127.22 |
| 50710.8084 | 2127.22 |
| 50721.0485 | 2127.34 |
| 50731.2886 | 2130.26 |
| 50741.5287 | 2135.61 |
| 50751.7688 | 2134.43 |
| 50762.0089 | 2138.49 |
| 50772.249 | 2138.6 |
| 50782.4891 | 2141.58 |
| 50792.7292 | 2148.62 |
| 50802.9693 | 2155.94 |
| 50813.2094 | 2169.34 |
| 50823.4495 | 2168.37 |
| 50833.6896 | 2211.22 |
| 50843.9296 | 2235.38 |
| 50854.1697 | 2266 |
| 50864.4098 | 2320.35 |
| 50874.6499 | 2326.94 |
| 50884.89 | 2322.72 |
| 50895.1301 | 2319.33 |
| 50905.3702 | 2335.55 |
| 50915.6103 | 2335.83 |
| 50925.8504 | 2342.37 |
| 50936.0905 | 2337.58 |
| 50946.3306 | 2352.39 |
| 50956.5707 | 2351.37 |
| 50966.8108 | 2359.48 |
| 50977.0509 | 2359.48 |
| 50987.291 | 2359.48 |
| 50997.5311 | 2359.54 |
| 51007.7711 | 2361 |
| 51018.0112 | 2365.11 |
| 51028.2513 | 2398.89 |
| 51038.4914 | 2398.89 |
| 51048.7315 | 2398.39 |
| 51058.9716 | 2386.68 |
| 51069.2117 | 2397.6 |
| 51079.4518 | 2400.47 |
| 51089.6919 | 2404.58 |
| 51099.932 | 2406.05 |
| 51110.1721 | 2409.03 |
| 51120.4122 | 2415.84 |
| 51130.6523 | 2417.36 |
| 51140.8924 | 2421.53 |
| 51151.1325 | 2424.23 |
| 51161.3726 | 2424.23 |
| 51171.6126 | 2424.4 |
| 51181.8527 | 2428.85 |
| 51192.0928 | 2438.31 |
| 51202.3329 | 2438.76 |
| 51212.573 | 2449.57 |
| 51222.8131 | 2449.85 |
| 51233.0532 | 2456.61 |
| 51243.2933 | 2456.61 |
| 51253.5334 | 2456.38 |
| 51263.7735 | 2450.92 |
| 51274.0136 | 2449.63 |
| 51284.2537 | 2450.98 |
| 51294.4938 | 2451.15 |
| 51304.7339 | 2455.14 |
| 51314.974 | 2453.85 |
| 51325.2141 | 2455.59 |
| 51335.4541 | 2464.04 |
| 51345.6942 | 2439.72 |
| 51355.9343 | 2439.94 |
| 51366.1744 | 2445.23 |
| 51376.4145 | 2442.47 |
| 51386.6546 | 2441.12 |
| 51396.8947 | 2441.12 |
| 51407.1348 | 2441.12 |
| 51417.3749 | 2442.43 |
| 51427.615 | 2472.31 |
| 51437.8551 | 2444.79 |
| 51448.0952 | 2464.6 |
| 51458.3353 | 2453.22 |
| 51468.5754 | 2439.72 |
| 51478.8155 | 2440.4 |
| 51489.0556 | 2454.91 |
| 51499.2957 | 2412.51 |
| 51509.5357 | 2367.13 |
| 51519.7758 | 2348.67 |
| 51530.0159 | 2359.42 |
| 51540.256 | 2357.45 |
| 51550.4961 | 2342.7 |
| 51560.7362 | 2345.12 |
| 51570.9763 | 2336.44 |
| 51581.2164 | 2290.51 |
| 51591.4565 | 2290.51 |
| 51601.6966 | 2290.17 |
| 51611.9367 | 2282.06 |
| 51622.1768 | 2282.12 |
| 51632.4169 | 2283.64 |
| 51642.657 | 2287.24 |
| 51652.8971 | 2275.92 |
| 51663.1372 | 2263.19 |
| 51673.3772 | 2250.43 |
| 51683.6173 | 2266.85 |
| 51693.8574 | 2239.83 |
| 51704.0975 | 2240.29 |
| 51714.3376 | 2250.92 |
| 51724.5777 | 2246.82 |
| 51734.8178 | 2245.41 |
| 51745.0579 | 2243.94 |
| 51755.298 | 2241.24 |
| 51765.5381 | 2241.24 |
| 51775.7782 | 2241.24 |
| 51786.0183 | 2241.3 |
| 51796.2584 | 2242.65 |
| 51806.4985 | 2242.65 |
| 51816.7386 | 2242.71 |
| 51826.9787 | 2244.34 |
| 51837.2188 | 2251.21 |
| 51847.4588 | 2254.08 |
| 51857.6989 | 2258.08 |
| 51867.939 | 2256.67 |
| 51878.1791 | 2255.78 |
| 51888.4192 | 2268.07 |
| 51898.6593 | 2303.12 |
| 51908.8994 | 2301.71 |
| 51919.1395 | 2300.3 |
| 51929.3796 | 2298.95 |
| 51939.6197 | 2298.95 |
| 51949.8598 | 2298.84 |
| 51960.0999 | 2296.14 |
| 51970.34 | 2296.65 |
| 51980.5801 | 2309.49 |
| 51990.8202 | 2325.7 |
| 52001.0603 | 2325.99 |
| 52011.3003 | 2332.74 |
| 52021.5404 | 2333.6 |
| 52031.7805 | 2353.85 |
| 52042.0206 | 2354.08 |
| 52052.2607 | 2359.42 |
| 52062.5008 | 2358.19 |
| 52072.7409 | 2361.46 |
| 52082.981 | 2375.08 |
| 52093.2211 | 2378.47 |
| 52103.4612 | 2396.17 |
| 52113.7013 | 2432.19 |
| 52123.9414 | 2453.5 |
| 52134.1815 | 2447.04 |
| 52144.4216 | 2453.85 |
| 52154.6617 | 2455.43 |
| 52164.9018 | 2460.94 |
| 52175.1418 | 2463.93 |
| 52185.3819 | 2470.86 |
| 52195.622 | 2475.02 |
| 52205.8621 | 2477.72 |
| 52216.1022 | 2478.93 |
| 52226.3423 | 2507.28 |
| 52236.5824 | 2506.47 |
| 52246.8225 | 2488.21 |
| 52257.0626 | 2503.23 |
| 52267.3027 | 2507.34 |
| 52277.5428 | 2508.63 |
| 52287.7829 | 2507.45 |
| 52298.023 | 2511.56 |
| 52308.2631 | 2513.55 |
| 52318.5032 | 2528.63 |
| 52328.7433 | 2533.62 |
| 52338.9834 | 2524.46 |
| 52349.2234 | 2531.44 |
| 52359.4635 | 2536.9 |
| 52369.7036 | 2538.31 |
| 52379.9437 | 2539.71 |
| 52390.1838 | 2542.97 |
| 52400.4239 | 2585.78 |
| 52410.664 | 2545.34 |
| 52420.9041 | 2548.31 |
| 52431.1442 | 2586.45 |
| 52441.3843 | 2594.26 |
| 52451.6244 | 2587.57 |
| 52461.8645 | 2589.33 |
| 52472.1046 | 2598.78 |
| 52482.3447 | 2598.95 |
| 52492.5848 | 2603.11 |
| 52502.8249 | 2605.87 |
| 52513.065 | 2607.28 |
| 52523.305 | 2608.57 |
| 52533.5451 | 2607.22 |
| 52543.7852 | 2606.12 |
| 52554.0253 | 2582.8 |
| 52564.2654 | 2636.67 |
| 52574.5055 | 2633.97 |
| 52584.7456 | 2633.97 |
| 52594.9857 | 2632.75 |
| 52605.2258 | 2605.28 |
| 52615.4659 | 2625.87 |
| 52625.706 | 2633.5 |
| 52635.9461 | 2623.05 |
| 52646.1862 | 2631.15 |
| 52656.4263 | 2631.38 |
| 52666.6664 | 2637.07 |
| 52676.9065 | 2644.69 |
| 52687.1465 | 2663.48 |
| 52697.3866 | 2631.08 |
| 52707.6267 | 2662.06 |
| 52717.8668 | 2660.77 |
| 52728.1069 | 2662.12 |
| 52738.347 | 2662.06 |
| 52748.5871 | 2660.71 |
| 52758.8272 | 2660.65 |
| 52769.0673 | 2659.36 |
| 52779.3074 | 2660.71 |
| 52789.5475 | 2660.77 |
| 52799.7876 | 2662.47 |
| 52810.0277 | 2670.56 |
| 52820.2678 | 2670.68 |
| 52830.5079 | 2673.44 |
| 52840.748 | 2675.02 |
| 52850.9881 | 2680.53 |
| 52861.2281 | 2683.23 |
| 52871.4682 | 2682.77 |
| 52881.7083 | 2672.32 |
| 52891.9484 | 2680.18 |
| 52902.1885 | 2675.78 |
| 52912.4286 | 2698.78 |
| 52922.6687 | 2700.12 |
| 52932.9088 | 2700.18 |
| 52943.1489 | 2701.53 |
| 52953.389 | 2701.65 |
| 52963.6291 | 2704.46 |
| 52973.8692 | 2707.22 |
| 52984.1093 | 2708.57 |
| 52994.3494 | 2708.57 |
| 53004.5895 | 2708.63 |
| 53014.8296 | 2709.8 |
| 53025.0696 | 2705.81 |
| 53035.3097 | 2707.16 |
| 53045.5498 | 2706.87 |
| 53055.7899 | 2700.48 |
| 53066.03 | 2708.16 |
| 53076.2701 | 2698.78 |
| 53086.5102 | 2700.12 |
| 53096.7503 | 2700.12 |
| 53106.9904 | 2700.12 |
| 53117.2305 | 2700.18 |
| 53127.4706 | 2701.53 |
| 53137.7107 | 2701.47 |
| 53147.9508 | 2700.07 |
| 53158.1909 | 2698.72 |
| 53168.431 | 2698.72 |
| 53178.6711 | 2698.66 |
| 53188.9112 | 2697.37 |
| 53199.1512 | 2698.78 |
| 53209.3913 | 2700.12 |
| 53219.6314 | 2700.24 |
| 53229.8715 | 2701.18 |
| 53240.1116 | 2660.65 |
| 53250.3517 | 2659.3 |
| 53260.5918 | 2659.3 |
| 53270.8319 | 2659.3 |
| 53281.072 | 2659.48 |
| 53291.3121 | 2664.29 |
| 53301.5522 | 2681.71 |
| 53311.7923 | 2679.01 |
| 53322.0324 | 2678.83 |
| 53332.2725 | 2674.79 |
| 53342.5126 | 2674.91 |
| 53352.7527 | 2677.48 |
| 53362.9928 | 2674.85 |
| 53373.2328 | 2676.25 |
| 53383.4729 | 2677.84 |
| 53393.713 | 2681.23 |
| 53403.9531 | 2635.43 |
| 53414.1932 | 2636.19 |
| 53424.4333 | 2622.71 |
| 53434.6734 | 2623.12 |
| 53444.9135 | 2632.62 |
| 53455.1536 | 2633.97 |
| 53465.3937 | 2633.97 |
| 53475.6338 | 2633.67 |
| 53485.8739 | 2627.22 |
| 53496.114 | 2632.07 |
| 53506.3541 | 2588.8 |
| 53516.5942 | 2586.11 |
| 53526.8343 | 2586.34 |
| 53537.0744 | 2591.38 |
| 53547.3144 | 2583.47 |
| 53557.5545 | 2586.63 |
| 53567.7946 | 2564.27 |
| 53578.0347 | 2514.48 |
| 53588.2748 | 2485.87 |
| 53598.5149 | 2479.13 |
| 53608.755 | 2478.83 |
| 53618.9951 | 2471.97 |
| 53629.2352 | 2468.98 |
| 53639.4753 | 2462.3 |
| 53649.7154 | 2463.59 |
| 53659.9555 | 2461.94 |
| 53670.1956 | 2455.2 |
| 53680.4357 | 2455.44 |
| 53690.6758 | 2460.18 |
| 53700.9159 | 2445.11 |
| 53711.156 | 2439.83 |
| 53721.396 | 2442.41 |
| 53731.6361 | 2439.36 |
| 53741.8762 | 2431.63 |
| 53752.1163 | 2439.48 |
| 53762.3564 | 2434.26 |
| 53772.5965 | 2438.66 |
| 53782.8366 | 2446.75 |
| 53793.0767 | 2446.87 |
| 53803.3168 | 2449.81 |
| 53813.5569 | 2457.7 |
| 53823.797 | 2514.56 |
| 53834.0371 | 2520.25 |
| 53844.2772 | 2527.34 |
| 53854.5173 | 2537.4 |
| 53864.7574 | 2581.88 |
| 53874.9975 | 2581.53 |
| 53885.2375 | 2573.68 |
| 53895.4776 | 2579.43 |
| 53905.7177 | 2587.69 |
| 53915.9578 | 2591.68 |
| 53926.1979 | 2590.57 |
| 53936.438 | 2595.84 |
| 53946.6781 | 2593.38 |
| 53956.9182 | 2599.13 |
| 53967.1583 | 2606.98 |
| 53977.3984 | 2602.31 |
| 53987.6385 | 2616.63 |
| 53997.8786 | 2574.91 |
| 54008.1187 | 2575.96 |
| 54018.3588 | 2569.22 |
| 54028.5989 | 2568.98 |
| 54038.839 | 2563.47 |
| 54049.0791 | 2560.83 |
| 54059.3191 | 2560.86 |
| 54069.5592 | 2530.85 |
| 54079.7993 | 2522.76 |
| 54090.0394 | 2522.59 |
| 54100.2795 | 2517.76 |
| 54110.5196 | 2500.02 |
| 54118.8044 | 2496.02 |